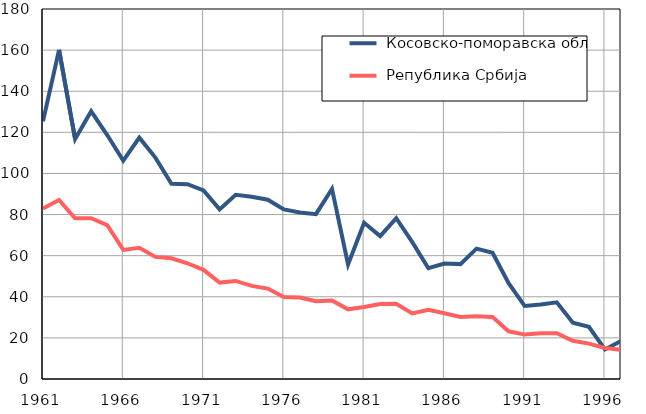
| Category |  Косовско-поморавска област |  Република Србија |
|---|---|---|
| 1961.0 | 125.4 | 82.9 |
| 1962.0 | 160.1 | 87.1 |
| 1963.0 | 116.7 | 78.2 |
| 1964.0 | 130.2 | 78.2 |
| 1965.0 | 118.7 | 74.9 |
| 1966.0 | 106.2 | 62.8 |
| 1967.0 | 117.4 | 63.8 |
| 1968.0 | 107.7 | 59.4 |
| 1969.0 | 95 | 58.7 |
| 1970.0 | 94.8 | 56.3 |
| 1971.0 | 91.7 | 53.1 |
| 1972.0 | 82.5 | 46.9 |
| 1973.0 | 89.6 | 47.7 |
| 1974.0 | 88.7 | 45.3 |
| 1975.0 | 87.2 | 44 |
| 1976.0 | 82.5 | 39.9 |
| 1977.0 | 81 | 39.6 |
| 1978.0 | 80.2 | 37.8 |
| 1979.0 | 92.5 | 38.2 |
| 1980.0 | 55.7 | 33.9 |
| 1981.0 | 76 | 35 |
| 1982.0 | 69.5 | 36.5 |
| 1983.0 | 78.2 | 36.6 |
| 1984.0 | 66.6 | 31.9 |
| 1985.0 | 53.9 | 33.7 |
| 1986.0 | 56.2 | 32 |
| 1987.0 | 55.9 | 30.2 |
| 1988.0 | 63.4 | 30.5 |
| 1989.0 | 61.4 | 30.2 |
| 1990.0 | 46.6 | 23.2 |
| 1991.0 | 35.5 | 21.6 |
| 1992.0 | 36.2 | 22.3 |
| 1993.0 | 37.3 | 22.3 |
| 1994.0 | 27.4 | 18.6 |
| 1995.0 | 25.4 | 17.2 |
| 1996.0 | 14.4 | 15.1 |
| 1997.0 | 18.5 | 14.2 |